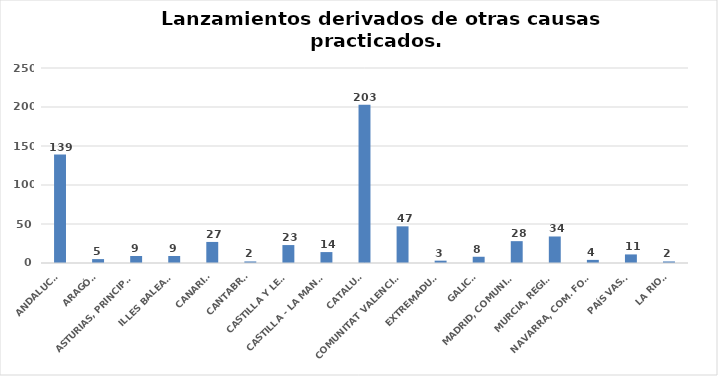
| Category | Series 0 |
|---|---|
| ANDALUCÍA | 139 |
| ARAGÓN | 5 |
| ASTURIAS, PRINCIPADO | 9 |
| ILLES BALEARS | 9 |
| CANARIAS | 27 |
| CANTABRIA | 2 |
| CASTILLA Y LEÓN | 23 |
| CASTILLA - LA MANCHA | 14 |
| CATALUÑA | 203 |
| COMUNITAT VALENCIANA | 47 |
| EXTREMADURA | 3 |
| GALICIA | 8 |
| MADRID, COMUNIDAD | 28 |
| MURCIA, REGIÓN | 34 |
| NAVARRA, COM. FORAL | 4 |
| PAÍS VASCO | 11 |
| LA RIOJA | 2 |